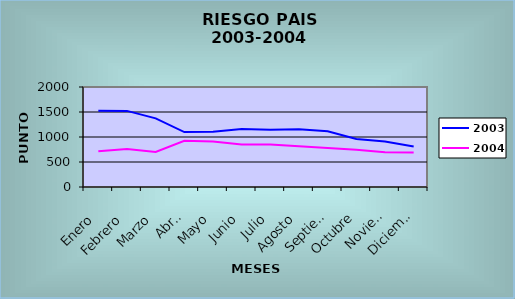
| Category | 2003 | 2004 |
|---|---|---|
| Enero | 1524 | 714 |
| Febrero | 1522 | 760 |
| Marzo | 1372 | 701 |
| Abril | 1099 | 925 |
| Mayo | 1107 | 909 |
| Junio | 1161 | 852 |
| Julio | 1147 | 852 |
| Agosto | 1153 | 813 |
| Septiembre | 1116 | 778 |
| Octubre | 961 | 745 |
| Noviembre | 910 | 696 |
| Diciembre | 809 | 690 |